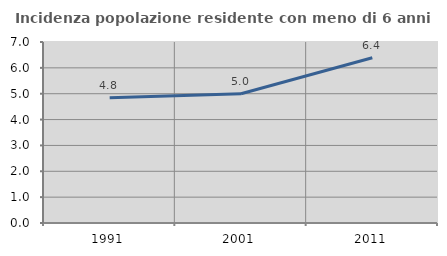
| Category | Incidenza popolazione residente con meno di 6 anni |
|---|---|
| 1991.0 | 4.848 |
| 2001.0 | 5 |
| 2011.0 | 6.389 |